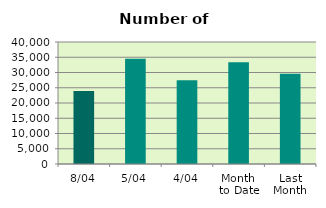
| Category | Series 0 |
|---|---|
| 8/04 | 23936 |
| 5/04 | 34544 |
| 4/04 | 27434 |
| Month 
to Date | 33342.333 |
| Last
Month | 29553.143 |